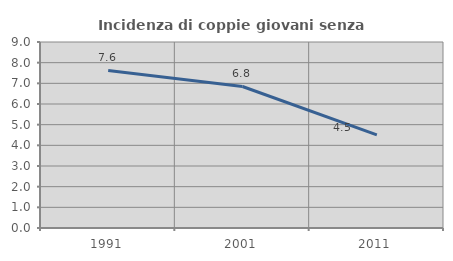
| Category | Incidenza di coppie giovani senza figli |
|---|---|
| 1991.0 | 7.622 |
| 2001.0 | 6.847 |
| 2011.0 | 4.502 |